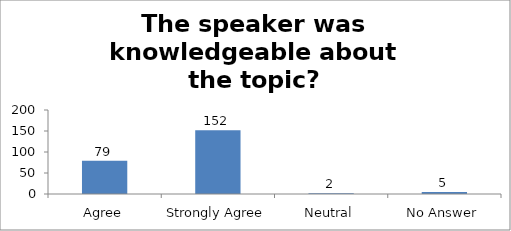
| Category | The speaker was knowledgeable about the topic? |
|---|---|
| Agree | 79 |
| Strongly Agree | 152 |
| Neutral | 2 |
| No Answer | 5 |